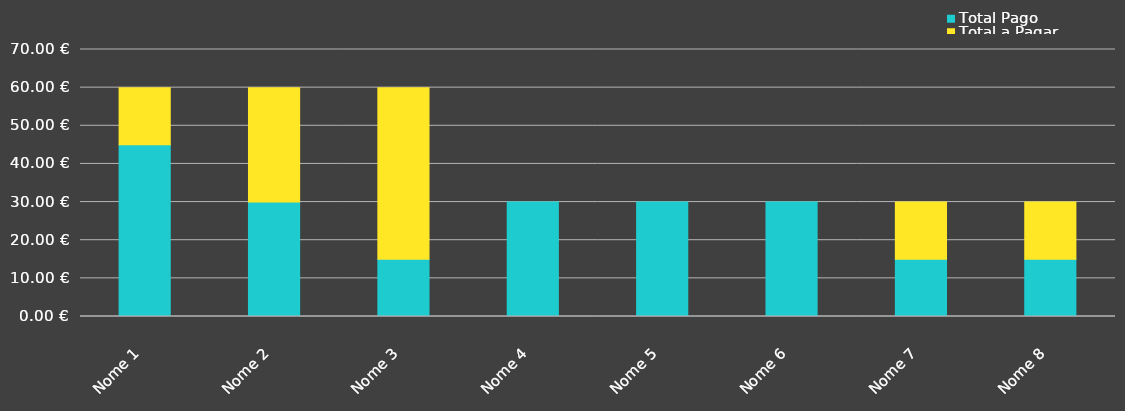
| Category | Total Pago | Total a Pagar |
|---|---|---|
| Nome 1 | 45 | 15 |
| Nome 2 | 30 | 30 |
| Nome 3 | 15 | 45 |
| Nome 4 | 30 | 0 |
| Nome 5 | 30 | 0 |
| Nome 6 | 30 | 0 |
| Nome 7 | 15 | 15 |
| Nome 8 | 15 | 15 |